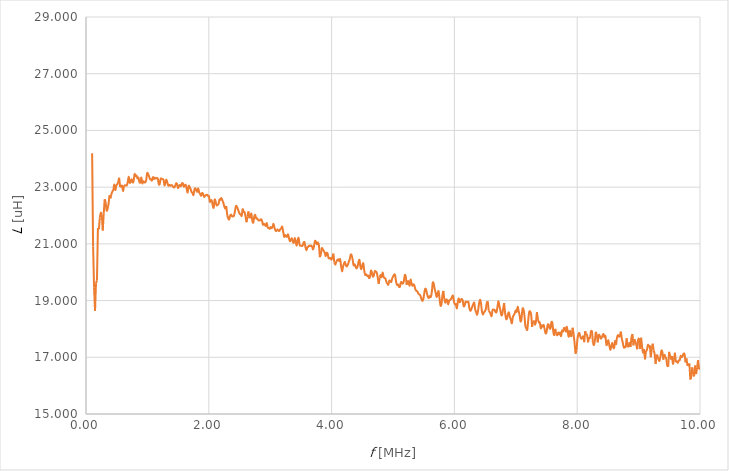
| Category | L [uH] |
|---|---|
| 0.1 | 24.194 |
| 0.115714285714286 | 20.91 |
| 0.131428571428571 | 19.449 |
| 0.14714285714285702 | 18.644 |
| 0.16285714285714298 | 19.614 |
| 0.178571428571429 | 19.715 |
| 0.194285714285714 | 21.562 |
| 0.21 | 21.519 |
| 0.225714285714286 | 21.939 |
| 0.24142857142857102 | 22.1 |
| 0.257142857142857 | 21.979 |
| 0.272857142857143 | 21.473 |
| 0.288571428571429 | 22.067 |
| 0.30428571428571405 | 22.573 |
| 0.32 | 22.463 |
| 0.33571428571428596 | 22.179 |
| 0.35142857142857103 | 22.236 |
| 0.367142857142857 | 22.412 |
| 0.382857142857143 | 22.711 |
| 0.39857142857142897 | 22.605 |
| 0.41428571428571404 | 22.757 |
| 0.43 | 22.846 |
| 0.44571428571428595 | 22.907 |
| 0.461428571428571 | 23.095 |
| 0.477142857142857 | 22.897 |
| 0.492857142857143 | 23.056 |
| 0.508571428571429 | 23.101 |
| 0.524285714285714 | 23.18 |
| 0.54 | 23.331 |
| 0.555714285714286 | 23.009 |
| 0.5714285714285711 | 23.015 |
| 0.5871428571428571 | 23.048 |
| 0.602857142857143 | 22.862 |
| 0.618571428571429 | 23.029 |
| 0.634285714285714 | 23.066 |
| 0.65 | 23.054 |
| 0.665714285714286 | 23.067 |
| 0.681428571428571 | 23.193 |
| 0.6971428571428571 | 23.362 |
| 0.712857142857143 | 23.154 |
| 0.728571428571429 | 23.206 |
| 0.744285714285714 | 23.274 |
| 0.76 | 23.162 |
| 0.775714285714286 | 23.219 |
| 0.791428571428571 | 23.46 |
| 0.807142857142857 | 23.385 |
| 0.822857142857143 | 23.407 |
| 0.838571428571429 | 23.306 |
| 0.854285714285714 | 23.335 |
| 0.87 | 23.179 |
| 0.885714285714286 | 23.168 |
| 0.901428571428571 | 23.34 |
| 0.917142857142857 | 23.133 |
| 0.9328571428571429 | 23.208 |
| 0.948571428571429 | 23.175 |
| 0.964285714285714 | 23.168 |
| 0.98 | 23.245 |
| 0.995714285714286 | 23.49 |
| 1.01142857142857 | 23.463 |
| 1.02714285714286 | 23.378 |
| 1.04285714285714 | 23.282 |
| 1.05857142857143 | 23.275 |
| 1.0742857142857098 | 23.231 |
| 1.09 | 23.353 |
| 1.10571428571429 | 23.287 |
| 1.1214285714285699 | 23.336 |
| 1.1371428571428601 | 23.3 |
| 1.15285714285714 | 23.32 |
| 1.16857142857143 | 23.3 |
| 1.18428571428571 | 23.116 |
| 1.2 | 23.104 |
| 1.2157142857142902 | 23.297 |
| 1.23142857142857 | 23.288 |
| 1.24714285714286 | 23.281 |
| 1.26285714285714 | 23.258 |
| 1.27857142857143 | 23.062 |
| 1.2942857142857098 | 23.175 |
| 1.31 | 23.264 |
| 1.32571428571429 | 23.15 |
| 1.3414285714285699 | 23.049 |
| 1.35714285714286 | 23.082 |
| 1.37285714285714 | 23.046 |
| 1.3885714285714301 | 23.07 |
| 1.40428571428571 | 23.062 |
| 1.42 | 23.006 |
| 1.4357142857142902 | 22.988 |
| 1.45142857142857 | 23.036 |
| 1.46714285714286 | 23.132 |
| 1.48285714285714 | 23.113 |
| 1.49857142857143 | 22.968 |
| 1.5142857142857098 | 23.038 |
| 1.53 | 23.076 |
| 1.54571428571429 | 23.035 |
| 1.56142857142857 | 23.128 |
| 1.57714285714286 | 23.132 |
| 1.5928571428571399 | 23.016 |
| 1.60857142857143 | 23.058 |
| 1.62428571428571 | 23.081 |
| 1.64 | 22.934 |
| 1.6557142857142901 | 22.812 |
| 1.67142857142857 | 23.042 |
| 1.6871428571428602 | 23.004 |
| 1.70285714285714 | 22.939 |
| 1.71857142857143 | 22.831 |
| 1.73428571428571 | 22.797 |
| 1.75 | 22.721 |
| 1.76571428571429 | 22.917 |
| 1.78142857142857 | 22.957 |
| 1.79714285714286 | 22.887 |
| 1.8128571428571398 | 22.837 |
| 1.82857142857143 | 22.955 |
| 1.8442857142857099 | 22.814 |
| 1.86 | 22.755 |
| 1.87571428571429 | 22.698 |
| 1.89142857142857 | 22.794 |
| 1.9071428571428601 | 22.756 |
| 1.92285714285714 | 22.658 |
| 1.93857142857143 | 22.691 |
| 1.95428571428571 | 22.719 |
| 1.97 | 22.732 |
| 1.9857142857142902 | 22.692 |
| 2.00142857142857 | 22.685 |
| 2.01714285714286 | 22.484 |
| 2.03285714285714 | 22.534 |
| 2.04857142857143 | 22.525 |
| 2.06428571428571 | 22.349 |
| 2.08 | 22.277 |
| 2.09571428571429 | 22.56 |
| 2.11142857142857 | 22.49 |
| 2.12714285714286 | 22.359 |
| 2.14285714285714 | 22.381 |
| 2.15857142857143 | 22.401 |
| 2.17428571428571 | 22.564 |
| 2.19 | 22.556 |
| 2.20571428571429 | 22.616 |
| 2.2214285714285698 | 22.53 |
| 2.23714285714286 | 22.444 |
| 2.25285714285714 | 22.315 |
| 2.26857142857143 | 22.241 |
| 2.28428571428571 | 22.336 |
| 2.3 | 22.014 |
| 2.3157142857142903 | 21.904 |
| 2.33142857142857 | 21.86 |
| 2.34714285714286 | 21.993 |
| 2.36285714285714 | 22.032 |
| 2.37857142857143 | 21.971 |
| 2.3942857142857097 | 21.971 |
| 2.41 | 21.991 |
| 2.42571428571429 | 22.146 |
| 2.44142857142857 | 22.328 |
| 2.45714285714286 | 22.314 |
| 2.4728571428571398 | 22.232 |
| 2.48857142857143 | 22.134 |
| 2.50428571428571 | 22.057 |
| 2.52 | 22.036 |
| 2.53571428571429 | 21.99 |
| 2.55142857142857 | 22.221 |
| 2.5671428571428603 | 22.125 |
| 2.58285714285714 | 22.115 |
| 2.59857142857143 | 21.963 |
| 2.61428571428571 | 21.763 |
| 2.63 | 21.96 |
| 2.64571428571429 | 22.143 |
| 2.66142857142857 | 21.903 |
| 2.67714285714286 | 21.966 |
| 2.69285714285714 | 22.067 |
| 2.70857142857143 | 21.821 |
| 2.7242857142857098 | 21.748 |
| 2.74 | 21.955 |
| 2.7557142857142902 | 22.022 |
| 2.77142857142857 | 21.895 |
| 2.78714285714286 | 21.9 |
| 2.80285714285714 | 21.845 |
| 2.81857142857143 | 21.822 |
| 2.83428571428571 | 21.828 |
| 2.85 | 21.873 |
| 2.86571428571429 | 21.822 |
| 2.88142857142857 | 21.674 |
| 2.89714285714286 | 21.708 |
| 2.91285714285714 | 21.671 |
| 2.92857142857143 | 21.636 |
| 2.94428571428571 | 21.732 |
| 2.96 | 21.576 |
| 2.97571428571429 | 21.561 |
| 2.9914285714285698 | 21.529 |
| 3.0071428571428602 | 21.596 |
| 3.02285714285714 | 21.551 |
| 3.03857142857143 | 21.598 |
| 3.05428571428571 | 21.704 |
| 3.07 | 21.564 |
| 3.0857142857142903 | 21.47 |
| 3.10142857142857 | 21.455 |
| 3.11714285714286 | 21.507 |
| 3.13285714285714 | 21.474 |
| 3.14857142857143 | 21.453 |
| 3.1642857142857097 | 21.515 |
| 3.18 | 21.547 |
| 3.19571428571429 | 21.606 |
| 3.21142857142857 | 21.431 |
| 3.22714285714286 | 21.248 |
| 3.2428571428571398 | 21.311 |
| 3.2585714285714302 | 21.267 |
| 3.27428571428571 | 21.253 |
| 3.29 | 21.335 |
| 3.30571428571429 | 21.201 |
| 3.32142857142857 | 21.09 |
| 3.33714285714286 | 21.159 |
| 3.35285714285714 | 21.193 |
| 3.36857142857143 | 21.084 |
| 3.38428571428571 | 21.038 |
| 3.4 | 21.202 |
| 3.41571428571429 | 21.086 |
| 3.43142857142857 | 20.94 |
| 3.44714285714286 | 21.118 |
| 3.46285714285714 | 21.211 |
| 3.47857142857143 | 20.967 |
| 3.4942857142857098 | 20.932 |
| 3.51 | 20.936 |
| 3.5257142857142902 | 20.93 |
| 3.54142857142857 | 21.025 |
| 3.55714285714286 | 21.064 |
| 3.57285714285714 | 20.902 |
| 3.58857142857143 | 20.778 |
| 3.60428571428571 | 20.864 |
| 3.62 | 20.903 |
| 3.63571428571429 | 20.94 |
| 3.65142857142857 | 20.923 |
| 3.66714285714286 | 20.941 |
| 3.6828571428571397 | 20.898 |
| 3.69857142857143 | 20.804 |
| 3.71428571428571 | 20.926 |
| 3.73 | 21.105 |
| 3.74571428571429 | 21.066 |
| 3.76142857142857 | 20.987 |
| 3.7771428571428602 | 21.05 |
| 3.79285714285714 | 20.956 |
| 3.80857142857143 | 20.532 |
| 3.82428571428571 | 20.618 |
| 3.84 | 20.842 |
| 3.8557142857142903 | 20.807 |
| 3.87142857142857 | 20.752 |
| 3.88714285714286 | 20.691 |
| 3.90285714285714 | 20.569 |
| 3.91857142857143 | 20.676 |
| 3.9342857142857097 | 20.662 |
| 3.95 | 20.505 |
| 3.96571428571429 | 20.485 |
| 3.98142857142857 | 20.502 |
| 3.99714285714286 | 20.443 |
| 4.01285714285714 | 20.518 |
| 4.02857142857143 | 20.655 |
| 4.04428571428571 | 20.345 |
| 4.06 | 20.265 |
| 4.07571428571429 | 20.359 |
| 4.09142857142857 | 20.426 |
| 4.10714285714286 | 20.452 |
| 4.12285714285714 | 20.394 |
| 4.13857142857143 | 20.463 |
| 4.1542857142857095 | 20.225 |
| 4.17 | 20.033 |
| 4.18571428571429 | 20.191 |
| 4.20142857142857 | 20.302 |
| 4.21714285714286 | 20.361 |
| 4.2328571428571395 | 20.243 |
| 4.24857142857143 | 20.202 |
| 4.26428571428571 | 20.264 |
| 4.28 | 20.363 |
| 4.29571428571429 | 20.463 |
| 4.31142857142857 | 20.62 |
| 4.32714285714286 | 20.591 |
| 4.34285714285714 | 20.448 |
| 4.35857142857143 | 20.24 |
| 4.37428571428571 | 20.281 |
| 4.39 | 20.204 |
| 4.40571428571429 | 20.13 |
| 4.42142857142857 | 20.195 |
| 4.43714285714286 | 20.342 |
| 4.45285714285714 | 20.437 |
| 4.46857142857143 | 20.208 |
| 4.4842857142857095 | 20.109 |
| 4.5 | 20.235 |
| 4.5157142857142905 | 20.315 |
| 4.53142857142857 | 20.059 |
| 4.54714285714286 | 19.903 |
| 4.56285714285714 | 19.925 |
| 4.57857142857143 | 19.87 |
| 4.59428571428571 | 19.878 |
| 4.61 | 19.794 |
| 4.62571428571429 | 19.845 |
| 4.64142857142857 | 20.056 |
| 4.65714285714286 | 19.979 |
| 4.67285714285714 | 19.843 |
| 4.68857142857143 | 19.901 |
| 4.70428571428571 | 20.036 |
| 4.72 | 20.022 |
| 4.73571428571429 | 19.984 |
| 4.75142857142857 | 19.81 |
| 4.7671428571428605 | 19.591 |
| 4.78285714285714 | 19.806 |
| 4.79857142857143 | 19.907 |
| 4.81428571428571 | 19.826 |
| 4.83 | 19.987 |
| 4.8457142857142905 | 19.847 |
| 4.86142857142857 | 19.797 |
| 4.87714285714286 | 19.773 |
| 4.89285714285714 | 19.657 |
| 4.90857142857143 | 19.596 |
| 4.92428571428571 | 19.561 |
| 4.94 | 19.7 |
| 4.95571428571429 | 19.691 |
| 4.97142857142857 | 19.653 |
| 4.98714285714286 | 19.786 |
| 5.00285714285714 | 19.849 |
| 5.0185714285714305 | 19.918 |
| 5.03428571428571 | 19.894 |
| 5.05 | 19.669 |
| 5.06571428571429 | 19.554 |
| 5.08142857142857 | 19.567 |
| 5.09714285714286 | 19.49 |
| 5.11285714285714 | 19.49 |
| 5.12857142857143 | 19.644 |
| 5.14428571428571 | 19.637 |
| 5.16 | 19.596 |
| 5.17571428571429 | 19.674 |
| 5.19142857142857 | 19.892 |
| 5.20714285714286 | 19.851 |
| 5.22285714285714 | 19.554 |
| 5.23857142857143 | 19.708 |
| 5.25428571428571 | 19.652 |
| 5.27 | 19.528 |
| 5.28571428571429 | 19.739 |
| 5.30142857142857 | 19.609 |
| 5.31714285714286 | 19.52 |
| 5.33285714285714 | 19.576 |
| 5.34857142857143 | 19.532 |
| 5.36428571428571 | 19.4 |
| 5.38 | 19.342 |
| 5.39571428571429 | 19.329 |
| 5.41142857142857 | 19.247 |
| 5.42714285714286 | 19.216 |
| 5.4428571428571395 | 19.186 |
| 5.45857142857143 | 19.089 |
| 5.47428571428571 | 18.996 |
| 5.49 | 19.024 |
| 5.50571428571429 | 19.207 |
| 5.52142857142857 | 19.401 |
| 5.53714285714286 | 19.399 |
| 5.55285714285714 | 19.252 |
| 5.56857142857143 | 19.128 |
| 5.58428571428571 | 19.093 |
| 5.6 | 19.159 |
| 5.61571428571429 | 19.126 |
| 5.63142857142857 | 19.289 |
| 5.64714285714286 | 19.624 |
| 5.66285714285714 | 19.599 |
| 5.67857142857143 | 19.413 |
| 5.6942857142857095 | 19.282 |
| 5.71 | 19.13 |
| 5.72571428571429 | 19.22 |
| 5.74142857142857 | 19.333 |
| 5.75714285714286 | 19.086 |
| 5.77285714285714 | 18.83 |
| 5.78857142857143 | 18.867 |
| 5.80428571428571 | 19.171 |
| 5.82 | 19.34 |
| 5.83571428571429 | 19.047 |
| 5.85142857142857 | 18.92 |
| 5.86714285714286 | 19.037 |
| 5.88285714285714 | 19.005 |
| 5.89857142857143 | 18.861 |
| 5.91428571428571 | 19 |
| 5.93 | 19.022 |
| 5.94571428571429 | 19.062 |
| 5.96142857142857 | 19.131 |
| 5.97714285714286 | 19.172 |
| 5.99285714285714 | 18.963 |
| 6.00857142857143 | 18.86 |
| 6.02428571428571 | 18.877 |
| 6.04 | 18.725 |
| 6.0557142857142905 | 18.957 |
| 6.07142857142857 | 19.077 |
| 6.08714285714286 | 18.942 |
| 6.10285714285714 | 19.015 |
| 6.11857142857143 | 19.057 |
| 6.13428571428571 | 19.013 |
| 6.15 | 18.805 |
| 6.16571428571429 | 18.827 |
| 6.18142857142857 | 18.957 |
| 6.19714285714286 | 18.941 |
| 6.21285714285714 | 18.942 |
| 6.22857142857143 | 18.95 |
| 6.24428571428571 | 18.725 |
| 6.26 | 18.637 |
| 6.27571428571429 | 18.698 |
| 6.29142857142857 | 18.788 |
| 6.3071428571428605 | 18.875 |
| 6.32285714285714 | 18.922 |
| 6.33857142857143 | 18.69 |
| 6.35428571428571 | 18.59 |
| 6.37 | 18.501 |
| 6.38571428571429 | 18.658 |
| 6.40142857142857 | 18.893 |
| 6.41714285714286 | 19.031 |
| 6.43285714285714 | 18.909 |
| 6.44857142857143 | 18.623 |
| 6.46428571428571 | 18.511 |
| 6.48 | 18.58 |
| 6.49571428571429 | 18.622 |
| 6.51142857142857 | 18.698 |
| 6.52714285714286 | 18.912 |
| 6.54285714285714 | 18.977 |
| 6.55857142857143 | 18.642 |
| 6.57428571428571 | 18.595 |
| 6.59 | 18.522 |
| 6.60571428571429 | 18.451 |
| 6.62142857142857 | 18.666 |
| 6.63714285714286 | 18.674 |
| 6.65285714285714 | 18.675 |
| 6.66857142857143 | 18.602 |
| 6.68428571428571 | 18.585 |
| 6.7 | 18.757 |
| 6.71571428571429 | 18.973 |
| 6.7314285714285695 | 18.825 |
| 6.74714285714286 | 18.677 |
| 6.76285714285714 | 18.495 |
| 6.77857142857143 | 18.506 |
| 6.79428571428571 | 18.719 |
| 6.81 | 18.911 |
| 6.82571428571429 | 18.563 |
| 6.84142857142857 | 18.358 |
| 6.85714285714286 | 18.366 |
| 6.87285714285714 | 18.525 |
| 6.88857142857143 | 18.578 |
| 6.9042857142857095 | 18.419 |
| 6.92 | 18.324 |
| 6.93571428571429 | 18.197 |
| 6.95142857142857 | 18.414 |
| 6.96714285714286 | 18.483 |
| 6.9828571428571395 | 18.555 |
| 6.99857142857143 | 18.653 |
| 7.01428571428571 | 18.603 |
| 7.03 | 18.779 |
| 7.04571428571429 | 18.629 |
| 7.06142857142857 | 18.484 |
| 7.07714285714286 | 18.264 |
| 7.09285714285714 | 18.362 |
| 7.10857142857143 | 18.698 |
| 7.12428571428571 | 18.694 |
| 7.14 | 18.489 |
| 7.15571428571429 | 18.11 |
| 7.17142857142857 | 18.019 |
| 7.18714285714286 | 17.978 |
| 7.20285714285714 | 18.324 |
| 7.21857142857143 | 18.6 |
| 7.2342857142857095 | 18.609 |
| 7.25 | 18.501 |
| 7.2657142857142905 | 18.07 |
| 7.28142857142857 | 18.26 |
| 7.29714285714286 | 18.268 |
| 7.31285714285714 | 18.147 |
| 7.32857142857143 | 18.266 |
| 7.34428571428571 | 18.594 |
| 7.36 | 18.344 |
| 7.37571428571429 | 18.229 |
| 7.39142857142857 | 18.225 |
| 7.40714285714286 | 18.02 |
| 7.42285714285714 | 18.125 |
| 7.43857142857143 | 18.082 |
| 7.45428571428571 | 18.136 |
| 7.47 | 17.983 |
| 7.48571428571429 | 17.842 |
| 7.50142857142857 | 17.894 |
| 7.5171428571428605 | 18.124 |
| 7.53285714285714 | 18.158 |
| 7.54857142857143 | 18.027 |
| 7.56428571428571 | 18.023 |
| 7.58 | 18.234 |
| 7.5957142857142905 | 18.204 |
| 7.61142857142857 | 17.891 |
| 7.62714285714286 | 17.786 |
| 7.64285714285714 | 18.004 |
| 7.65857142857143 | 17.828 |
| 7.67428571428571 | 17.775 |
| 7.69 | 17.871 |
| 7.70571428571429 | 17.806 |
| 7.72142857142857 | 17.869 |
| 7.73714285714286 | 17.746 |
| 7.75285714285714 | 17.941 |
| 7.7685714285714305 | 17.908 |
| 7.78428571428571 | 18.026 |
| 7.8 | 18.027 |
| 7.81571428571429 | 17.906 |
| 7.83142857142857 | 18.077 |
| 7.84714285714286 | 17.875 |
| 7.86285714285714 | 17.727 |
| 7.87857142857143 | 17.954 |
| 7.89428571428571 | 17.725 |
| 7.91 | 17.769 |
| 7.92571428571429 | 18.041 |
| 7.94142857142857 | 17.817 |
| 7.95714285714286 | 17.512 |
| 7.97285714285714 | 17.127 |
| 7.98857142857143 | 17.237 |
| 8.00428571428571 | 17.648 |
| 8.02 | 17.813 |
| 8.03571428571429 | 17.852 |
| 8.05142857142857 | 17.722 |
| 8.06714285714286 | 17.654 |
| 8.08285714285714 | 17.688 |
| 8.09857142857143 | 17.732 |
| 8.11428571428571 | 17.533 |
| 8.13 | 17.919 |
| 8.14571428571429 | 17.829 |
| 8.16142857142857 | 17.775 |
| 8.17714285714286 | 17.528 |
| 8.19285714285714 | 17.714 |
| 8.20857142857143 | 17.691 |
| 8.22428571428571 | 17.915 |
| 8.24 | 17.942 |
| 8.25571428571429 | 17.533 |
| 8.27142857142857 | 17.432 |
| 8.287142857142861 | 17.587 |
| 8.30285714285714 | 17.896 |
| 8.31857142857143 | 17.799 |
| 8.33428571428571 | 17.527 |
| 8.35 | 17.814 |
| 8.36571428571429 | 17.773 |
| 8.38142857142857 | 17.663 |
| 8.39714285714286 | 17.684 |
| 8.41285714285714 | 17.764 |
| 8.428571428571429 | 17.821 |
| 8.44428571428571 | 17.707 |
| 8.46 | 17.749 |
| 8.47571428571429 | 17.437 |
| 8.491428571428571 | 17.51 |
| 8.50714285714286 | 17.599 |
| 8.52285714285714 | 17.424 |
| 8.538571428571428 | 17.269 |
| 8.554285714285712 | 17.366 |
| 8.57 | 17.515 |
| 8.585714285714289 | 17.373 |
| 8.60142857142857 | 17.332 |
| 8.61714285714286 | 17.598 |
| 8.63285714285714 | 17.44 |
| 8.64857142857143 | 17.713 |
| 8.664285714285711 | 17.785 |
| 8.68 | 17.724 |
| 8.695714285714288 | 17.762 |
| 8.711428571428572 | 17.884 |
| 8.72714285714286 | 17.653 |
| 8.74285714285714 | 17.509 |
| 8.758571428571429 | 17.349 |
| 8.77428571428571 | 17.359 |
| 8.79 | 17.386 |
| 8.80571428571429 | 17.669 |
| 8.821428571428571 | 17.356 |
| 8.83714285714286 | 17.406 |
| 8.85285714285714 | 17.51 |
| 8.868571428571428 | 17.361 |
| 8.884285714285712 | 17.717 |
| 8.9 | 17.818 |
| 8.915714285714289 | 17.421 |
| 8.93142857142857 | 17.636 |
| 8.94714285714286 | 17.556 |
| 8.962857142857139 | 17.435 |
| 8.97857142857143 | 17.285 |
| 8.994285714285711 | 17.664 |
| 9.01 | 17.675 |
| 9.025714285714288 | 17.295 |
| 9.04142857142857 | 17.69 |
| 9.05714285714286 | 17.362 |
| 9.07285714285714 | 17.162 |
| 9.088571428571429 | 17.293 |
| 9.10428571428571 | 16.927 |
| 9.12 | 17.226 |
| 9.13571428571429 | 17.256 |
| 9.151428571428571 | 17.438 |
| 9.16714285714286 | 17.382 |
| 9.18285714285714 | 17.42 |
| 9.198571428571428 | 17.004 |
| 9.21428571428571 | 17.298 |
| 9.23 | 17.479 |
| 9.245714285714289 | 17.242 |
| 9.26142857142857 | 17.104 |
| 9.27714285714286 | 16.769 |
| 9.29285714285714 | 17.094 |
| 9.30857142857143 | 17.04 |
| 9.324285714285711 | 16.922 |
| 9.34 | 16.874 |
| 9.355714285714289 | 17.029 |
| 9.37142857142857 | 17.235 |
| 9.38714285714286 | 17.182 |
| 9.40285714285714 | 16.916 |
| 9.418571428571429 | 17.112 |
| 9.43428571428571 | 17.007 |
| 9.45 | 16.956 |
| 9.46571428571429 | 16.719 |
| 9.481428571428571 | 16.669 |
| 9.49714285714286 | 17.191 |
| 9.51285714285714 | 17.042 |
| 9.528571428571428 | 16.932 |
| 9.54428571428571 | 17.044 |
| 9.56 | 16.748 |
| 9.57571428571429 | 16.914 |
| 9.59142857142857 | 17.161 |
| 9.60714285714286 | 16.829 |
| 9.62285714285714 | 16.853 |
| 9.63857142857143 | 16.805 |
| 9.654285714285711 | 16.889 |
| 9.67 | 16.9 |
| 9.685714285714289 | 17.051 |
| 9.70142857142857 | 17.003 |
| 9.71714285714286 | 17.041 |
| 9.73285714285714 | 17.126 |
| 9.748571428571429 | 17.101 |
| 9.76428571428571 | 16.821 |
| 9.78 | 16.961 |
| 9.79571428571429 | 16.7 |
| 9.811428571428571 | 16.733 |
| 9.82714285714286 | 16.779 |
| 9.84285714285714 | 16.216 |
| 9.858571428571429 | 16.308 |
| 9.87428571428571 | 16.644 |
| 9.89 | 16.395 |
| 9.90571428571429 | 16.366 |
| 9.92142857142857 | 16.712 |
| 9.93714285714286 | 16.407 |
| 9.95285714285714 | 16.63 |
| 9.96857142857143 | 16.905 |
| 9.984285714285711 | 16.58 |
| 10.0 | 16.621 |